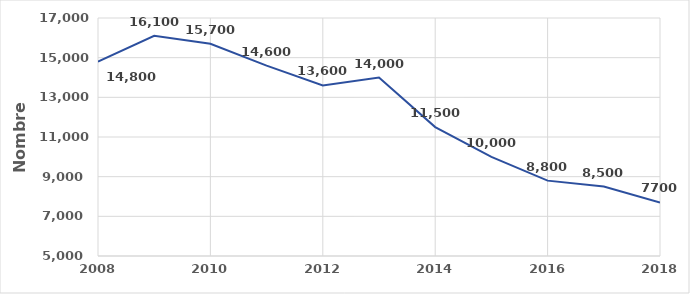
| Category | Series 0 |
|---|---|
| 2008.0 | 14800 |
| 2009.0 | 16100 |
| 2010.0 | 15700 |
| 2011.0 | 14600 |
| 2012.0 | 13600 |
| 2013.0 | 14000 |
| 2014.0 | 11500 |
| 2015.0 | 10000 |
| 2016.0 | 8800 |
| 2017.0 | 8500 |
| 2018.0 | 7700 |